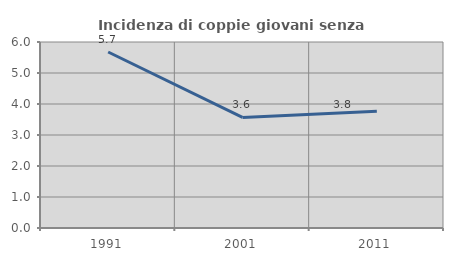
| Category | Incidenza di coppie giovani senza figli |
|---|---|
| 1991.0 | 5.678 |
| 2001.0 | 3.567 |
| 2011.0 | 3.769 |